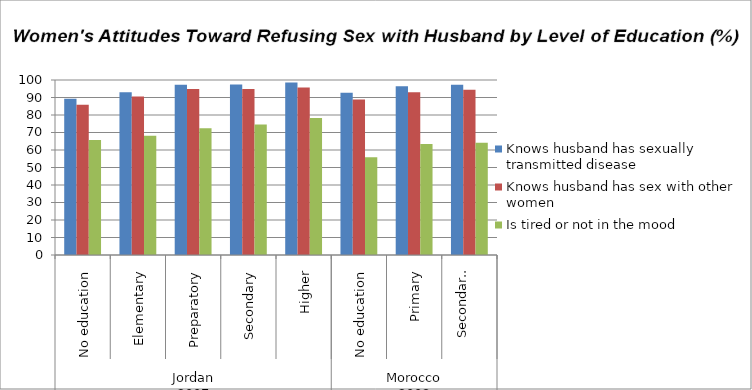
| Category | Knows husband has sexually transmitted disease  | Knows husband has sex with other women  | Is tired or not in the mood  |
|---|---|---|---|
| 0 | 89.3 | 85.9 | 65.7 |
| 1 | 93 | 90.6 | 68.2 |
| 2 | 97.3 | 94.9 | 72.5 |
| 3 | 97.5 | 94.9 | 74.6 |
| 4 | 98.6 | 95.7 | 78.3 |
| 5 | 92.7 | 88.8 | 55.8 |
| 6 | 96.5 | 93 | 63.5 |
| 7 | 97.3 | 94.4 | 64.1 |